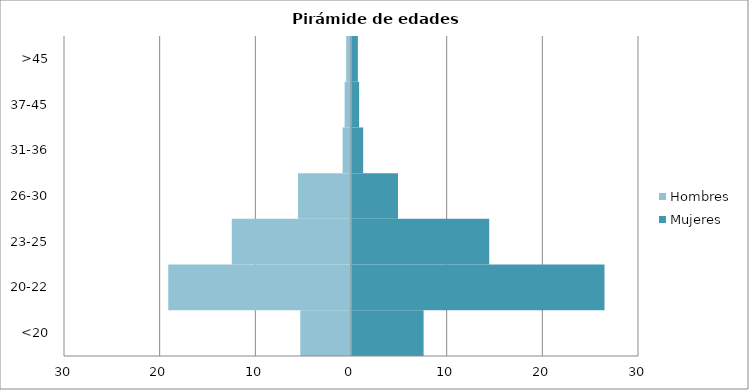
| Category | Mujeres | Hombres |
|---|---|---|
| <20 | 7.483 | -5.299 |
| 20-22 | 26.394 | -19.103 |
| 23-25 | 14.345 | -12.459 |
| 26-30 | 4.809 | -5.537 |
| 31-36 | 1.168 | -0.88 |
| 37-45 | 0.743 | -0.667 |
| >45 | 0.612 | -0.501 |